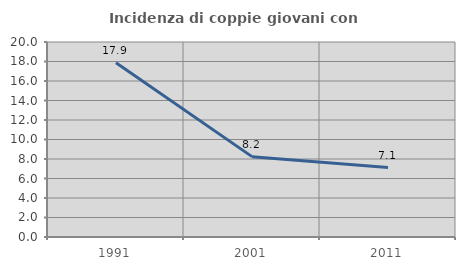
| Category | Incidenza di coppie giovani con figli |
|---|---|
| 1991.0 | 17.878 |
| 2001.0 | 8.242 |
| 2011.0 | 7.118 |